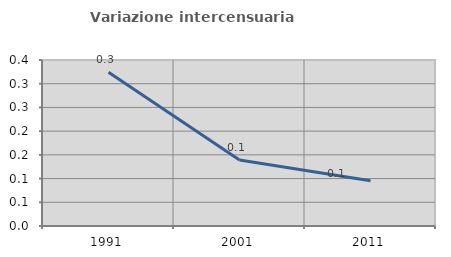
| Category | Variazione intercensuaria annua |
|---|---|
| 1991.0 | 0.324 |
| 2001.0 | 0.139 |
| 2011.0 | 0.095 |